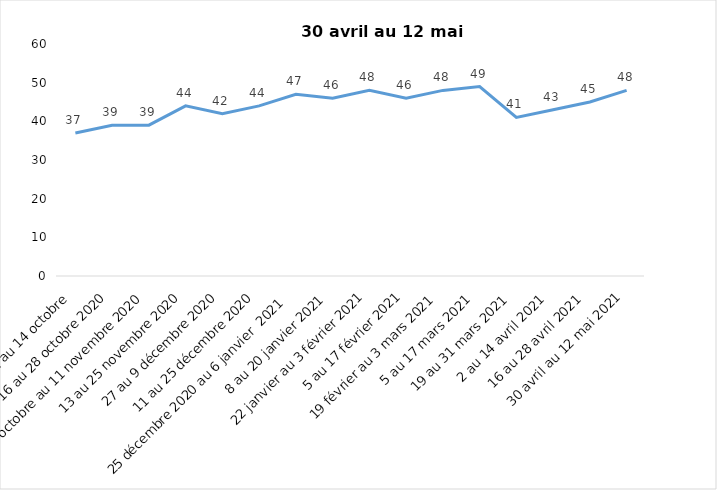
| Category | Toujours aux trois mesures |
|---|---|
| 2 au 14 octobre  | 37 |
| 16 au 28 octobre 2020 | 39 |
| 30 octobre au 11 novembre 2020 | 39 |
| 13 au 25 novembre 2020 | 44 |
| 27 au 9 décembre 2020 | 42 |
| 11 au 25 décembre 2020 | 44 |
| 25 décembre 2020 au 6 janvier  2021 | 47 |
| 8 au 20 janvier 2021 | 46 |
| 22 janvier au 3 février 2021 | 48 |
| 5 au 17 février 2021 | 46 |
| 19 février au 3 mars 2021 | 48 |
| 5 au 17 mars 2021 | 49 |
| 19 au 31 mars 2021 | 41 |
| 2 au 14 avril 2021 | 43 |
| 16 au 28 avril 2021 | 45 |
| 30 avril au 12 mai 2021 | 48 |